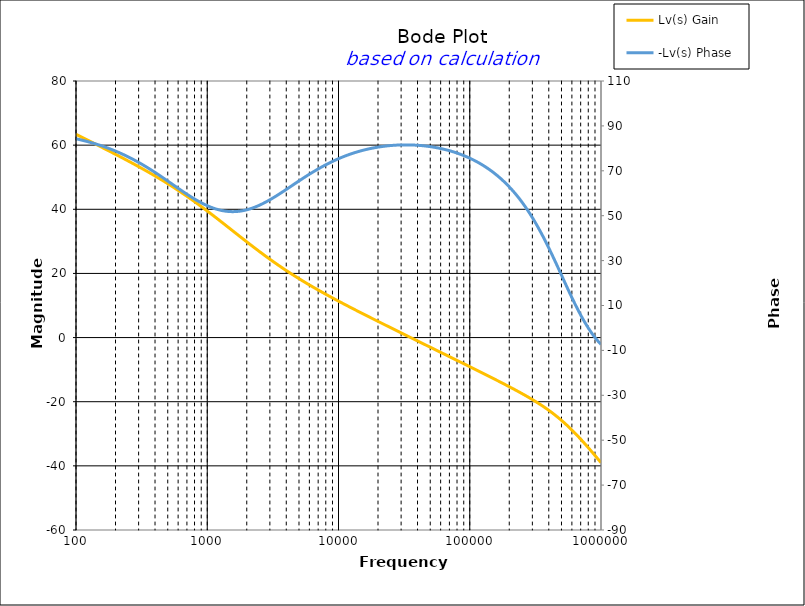
| Category | Lv(s) Gain |
|---|---|
| 100.0 | 63.366 |
| 104.71285480508996 | 62.96 |
| 109.64781961431851 | 62.552 |
| 114.81536214968828 | 62.144 |
| 120.2264434617413 | 61.735 |
| 125.89254117941672 | 61.326 |
| 131.82567385564073 | 60.915 |
| 138.0384264602885 | 60.503 |
| 144.54397707459273 | 60.091 |
| 151.35612484362082 | 59.677 |
| 158.48931924611136 | 59.262 |
| 165.95869074375605 | 58.845 |
| 173.78008287493756 | 58.427 |
| 181.97008586099835 | 58.008 |
| 190.54607179632475 | 57.586 |
| 199.526231496888 | 57.163 |
| 208.92961308540396 | 56.737 |
| 218.77616239495526 | 56.31 |
| 229.08676527677733 | 55.88 |
| 239.8832919019491 | 55.447 |
| 251.18864315095806 | 55.011 |
| 263.0267991895382 | 54.572 |
| 275.4228703338166 | 54.13 |
| 288.4031503126606 | 53.685 |
| 301.9951720402017 | 53.235 |
| 316.22776601683796 | 52.782 |
| 331.13112148259114 | 52.324 |
| 346.7368504525317 | 51.862 |
| 363.0780547701014 | 51.395 |
| 380.1893963205612 | 50.923 |
| 398.10717055349727 | 50.445 |
| 416.8693834703355 | 49.962 |
| 436.515832240166 | 49.473 |
| 457.0881896148751 | 48.977 |
| 478.6300923226384 | 48.475 |
| 501.18723362727235 | 47.967 |
| 524.8074602497726 | 47.451 |
| 549.5408738576245 | 46.928 |
| 575.4399373371572 | 46.398 |
| 602.559586074358 | 45.861 |
| 630.9573444801935 | 45.316 |
| 660.6934480075963 | 44.763 |
| 691.8309709189367 | 44.203 |
| 724.4359600749902 | 43.636 |
| 758.5775750291838 | 43.061 |
| 794.3282347242817 | 42.478 |
| 831.7637711026711 | 41.889 |
| 870.9635899560808 | 41.292 |
| 912.0108393559099 | 40.689 |
| 954.9925860214358 | 40.08 |
| 1000.0 | 39.464 |
| 1047.1285480509 | 38.843 |
| 1096.4781961431854 | 38.217 |
| 1148.1536214968835 | 37.587 |
| 1202.2644346174134 | 36.952 |
| 1258.925411794168 | 36.314 |
| 1318.2567385564075 | 35.673 |
| 1380.3842646028857 | 35.03 |
| 1445.4397707459275 | 34.385 |
| 1513.5612484362086 | 33.739 |
| 1584.8931924611136 | 33.093 |
| 1659.5869074375614 | 32.447 |
| 1737.8008287493756 | 31.802 |
| 1819.7008586099842 | 31.159 |
| 1905.4607179632476 | 30.518 |
| 1995.2623149688804 | 29.879 |
| 2089.29613085404 | 29.244 |
| 2187.7616239495537 | 28.613 |
| 2290.867652767774 | 27.987 |
| 2398.832919019492 | 27.365 |
| 2511.886431509581 | 26.749 |
| 2630.2679918953822 | 26.139 |
| 2754.2287033381667 | 25.535 |
| 2884.0315031266064 | 24.938 |
| 3019.9517204020162 | 24.348 |
| 3162.2776601683804 | 23.765 |
| 3311.311214825913 | 23.189 |
| 3467.368504525318 | 22.62 |
| 3630.7805477010156 | 22.059 |
| 3801.893963205614 | 21.506 |
| 3981.0717055349755 | 20.96 |
| 4168.693834703356 | 20.422 |
| 4365.158322401663 | 19.891 |
| 4570.881896148753 | 19.367 |
| 4786.300923226386 | 18.851 |
| 5011.872336272724 | 18.342 |
| 5248.074602497729 | 17.839 |
| 5495.408738576247 | 17.343 |
| 5754.39937337157 | 16.853 |
| 6025.595860743582 | 16.369 |
| 6309.573444801937 | 15.89 |
| 6606.934480075963 | 15.418 |
| 6918.309709189366 | 14.95 |
| 7244.359600749906 | 14.487 |
| 7585.775750291843 | 14.029 |
| 7943.28234724282 | 13.575 |
| 8317.637711026713 | 13.125 |
| 8709.635899560808 | 12.679 |
| 9120.108393559098 | 12.237 |
| 9549.925860214365 | 11.798 |
| 10000.0 | 11.362 |
| 10471.285480508997 | 10.929 |
| 10964.781961431861 | 10.498 |
| 11481.536214968835 | 10.07 |
| 12022.644346174135 | 9.644 |
| 12589.254117941677 | 9.221 |
| 13182.567385564085 | 8.799 |
| 13803.842646028861 | 8.379 |
| 14454.397707459284 | 7.961 |
| 15135.612484362091 | 7.544 |
| 15848.931924611154 | 7.129 |
| 16595.869074375623 | 6.714 |
| 17378.00828749377 | 6.302 |
| 18197.008586099848 | 5.89 |
| 19054.607179632498 | 5.479 |
| 19952.623149688818 | 5.069 |
| 20892.961308540394 | 4.66 |
| 21877.616239495524 | 4.251 |
| 22908.676527677744 | 3.844 |
| 23988.329190194912 | 3.437 |
| 25118.864315095805 | 3.03 |
| 26302.679918953818 | 2.624 |
| 27542.287033381683 | 2.218 |
| 28840.315031266073 | 1.813 |
| 30199.51720402017 | 1.409 |
| 31622.776601683825 | 1.004 |
| 33113.11214825913 | 0.6 |
| 34673.68504525318 | 0.196 |
| 36307.80547701015 | -0.207 |
| 38018.939632056165 | -0.611 |
| 39810.71705534976 | -1.014 |
| 41686.938347033574 | -1.417 |
| 43651.58322401662 | -1.82 |
| 45708.81896148756 | -2.223 |
| 47863.00923226389 | -2.626 |
| 50118.723362727265 | -3.029 |
| 52480.74602497729 | -3.431 |
| 54954.087385762534 | -3.834 |
| 57543.99373371576 | -4.237 |
| 60255.95860743583 | -4.64 |
| 63095.73444801938 | -5.043 |
| 66069.34480075965 | -5.446 |
| 69183.09709189367 | -5.849 |
| 72443.59600749903 | -6.252 |
| 75857.75750291838 | -6.656 |
| 79432.82347242821 | -7.059 |
| 83176.37711026715 | -7.463 |
| 87096.3589956081 | -7.868 |
| 91201.08393559098 | -8.272 |
| 95499.25860214367 | -8.678 |
| 100000.0 | -9.083 |
| 104712.85480509 | -9.489 |
| 109647.81961431864 | -9.896 |
| 114815.3621496884 | -10.304 |
| 120226.44346174138 | -10.712 |
| 125892.5411794168 | -11.121 |
| 131825.6738556409 | -11.531 |
| 138038.42646028864 | -11.942 |
| 144543.9770745929 | -12.355 |
| 151356.12484362093 | -12.769 |
| 158489.31924611155 | -13.185 |
| 165958.69074375625 | -13.603 |
| 173780.0828749377 | -14.023 |
| 181970.08586099852 | -14.445 |
| 190546.071796325 | -14.87 |
| 199526.2314968882 | -15.299 |
| 208929.6130854042 | -15.731 |
| 218776.1623949553 | -16.168 |
| 229086.7652767775 | -16.609 |
| 239883.29190194918 | -17.056 |
| 251188.64315095812 | -17.509 |
| 263026.79918953823 | -17.969 |
| 275422.8703338169 | -18.437 |
| 288403.1503126608 | -18.914 |
| 301995.1720402018 | -19.402 |
| 316227.766016838 | -19.901 |
| 331131.12148259114 | -20.413 |
| 346736.85045253224 | -20.939 |
| 363078.0547701019 | -21.482 |
| 380189.3963205617 | -22.042 |
| 398107.1705534977 | -22.621 |
| 416869.38347033586 | -23.221 |
| 436515.8322401663 | -23.843 |
| 457088.1896148753 | -24.489 |
| 478630.0923226385 | -25.16 |
| 501187.23362727324 | -25.856 |
| 524807.4602497736 | -26.578 |
| 549540.8738576254 | -27.327 |
| 575439.9373371577 | -28.102 |
| 602559.5860743586 | -28.903 |
| 630957.3444801938 | -29.729 |
| 660693.4480075965 | -30.579 |
| 691830.9709189369 | -31.451 |
| 724435.9600749904 | -32.343 |
| 758577.5750291839 | -33.254 |
| 794328.2347242816 | -34.182 |
| 831763.7711026709 | -35.125 |
| 870963.5899560819 | -36.08 |
| 912010.8393559109 | -37.046 |
| 954992.586021437 | -38.02 |
| 1000000.0 | -39.001 |